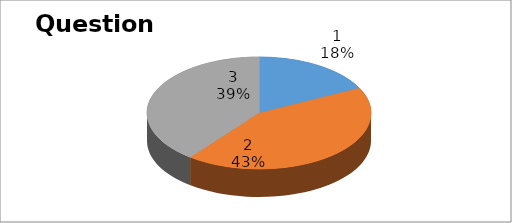
| Category | Series 0 |
|---|---|
| 0 | 37 |
| 1 | 90 |
| 2 | 83 |